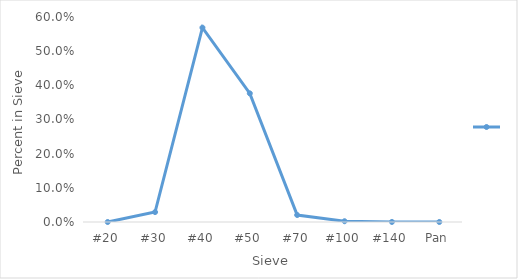
| Category | Series 0 |
|---|---|
| #20 | 0 |
| #30 | 0.029 |
| #40 | 0.569 |
| #50 | 0.377 |
| #70 | 0.02 |
| #100 | 0.002 |
| #140 | 0 |
| Pan | 0 |